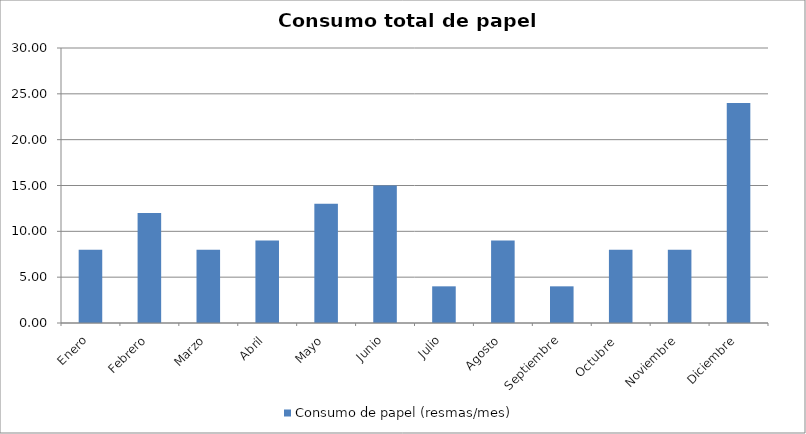
| Category | Consumo de papel (resmas/mes) |
|---|---|
| Enero | 8 |
| Febrero | 12 |
| Marzo | 8 |
| Abril | 9 |
| Mayo | 13 |
| Junio | 15 |
| Julio | 4 |
| Agosto | 9 |
| Septiembre | 4 |
| Octubre  | 8 |
| Noviembre | 8 |
| Diciembre | 24 |